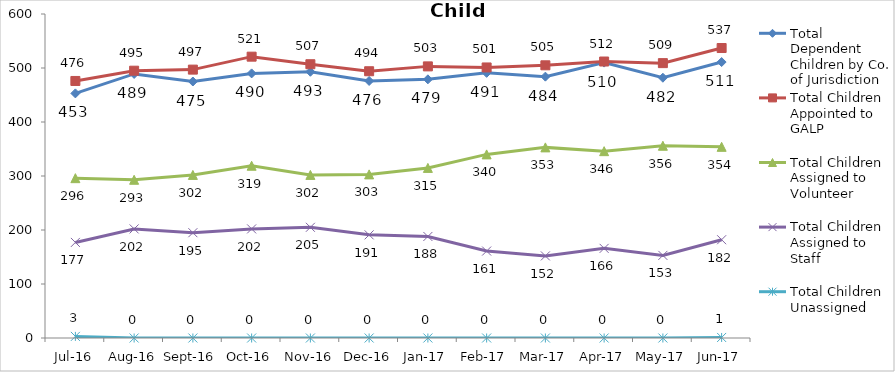
| Category | Total Dependent Children by Co. of Jurisdiction | Total Children Appointed to GALP | Total Children Assigned to Volunteer | Total Children Assigned to Staff | Total Children Unassigned |
|---|---|---|---|---|---|
| Jul-16 | 453 | 476 | 296 | 177 | 3 |
| Aug-16 | 489 | 495 | 293 | 202 | 0 |
| Sep-16 | 475 | 497 | 302 | 195 | 0 |
| Oct-16 | 490 | 521 | 319 | 202 | 0 |
| Nov-16 | 493 | 507 | 302 | 205 | 0 |
| Dec-16 | 476 | 494 | 303 | 191 | 0 |
| Jan-17 | 479 | 503 | 315 | 188 | 0 |
| Feb-17 | 491 | 501 | 340 | 161 | 0 |
| Mar-17 | 484 | 505 | 353 | 152 | 0 |
| Apr-17 | 510 | 512 | 346 | 166 | 0 |
| May-17 | 482 | 509 | 356 | 153 | 0 |
| Jun-17 | 511 | 537 | 354 | 182 | 1 |